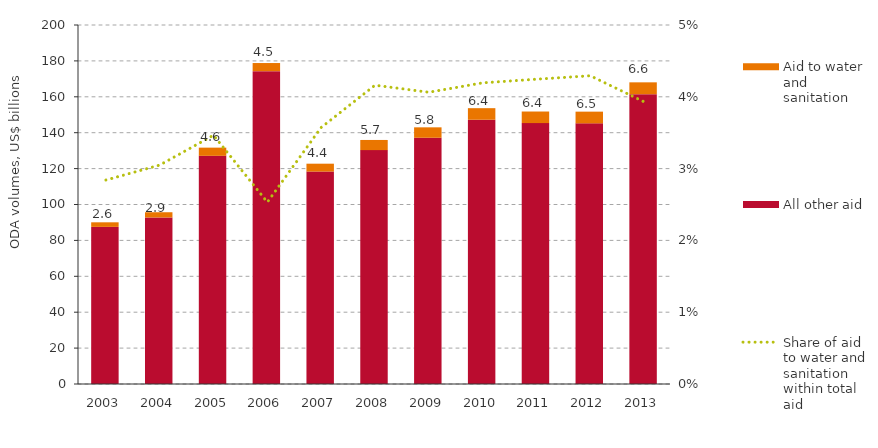
| Category | All other aid | Aid to water and sanitation |
|---|---|---|
| 2003 | 87.52 | 2.559 |
| 2004 | 92.77 | 2.918 |
| 2005 | 127.116 | 4.562 |
| 2006 | 174.284 | 4.528 |
| 2007 | 118.35 | 4.386 |
| 2008 | 130.299 | 5.658 |
| 2009 | 137.181 | 5.81 |
| 2010 | 147.221 | 6.445 |
| 2011 | 145.356 | 6.444 |
| 2012 | 145.217 | 6.514 |
| 2013 | 161.453 | 6.605 |